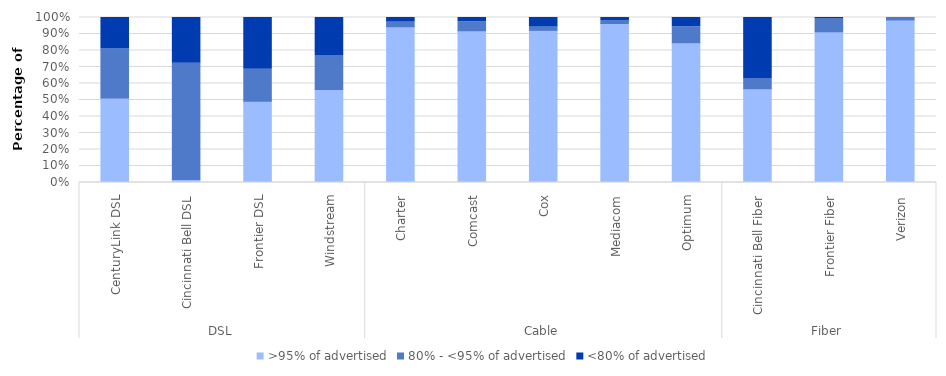
| Category | >95% of advertised | 80% - <95% of advertised | <80% of advertised |
|---|---|---|---|
| 0 | 0.512 | 0.298 | 0.19 |
| 1 | 0.019 | 0.704 | 0.278 |
| 2 | 0.493 | 0.194 | 0.313 |
| 3 | 0.563 | 0.207 | 0.23 |
| 4 | 0.944 | 0.028 | 0.028 |
| 5 | 0.92 | 0.054 | 0.026 |
| 6 | 0.922 | 0.019 | 0.058 |
| 7 | 0.964 | 0.018 | 0.018 |
| 8 | 0.847 | 0.096 | 0.056 |
| 9 | 0.569 | 0.059 | 0.373 |
| 10 | 0.913 | 0.077 | 0.01 |
| 11 | 0.985 | 0.015 | 0 |